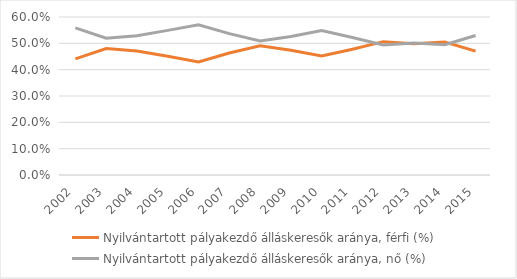
| Category | Nyilvántartott pályakezdő álláskeresők aránya, férfi (%) | Nyilvántartott pályakezdő álláskeresők aránya, nő (%) |
|---|---|---|
| 2002.0 | 0.441 | 0.559 |
| 2003.0 | 0.48 | 0.52 |
| 2004.0 | 0.471 | 0.529 |
| 2005.0 | 0.451 | 0.549 |
| 2006.0 | 0.429 | 0.571 |
| 2007.0 | 0.463 | 0.537 |
| 2008.0 | 0.491 | 0.509 |
| 2009.0 | 0.474 | 0.526 |
| 2010.0 | 0.452 | 0.548 |
| 2011.0 | 0.478 | 0.522 |
| 2012.0 | 0.506 | 0.494 |
| 2013.0 | 0.498 | 0.502 |
| 2014.0 | 0.505 | 0.495 |
| 2015.0 | 0.47 | 0.53 |